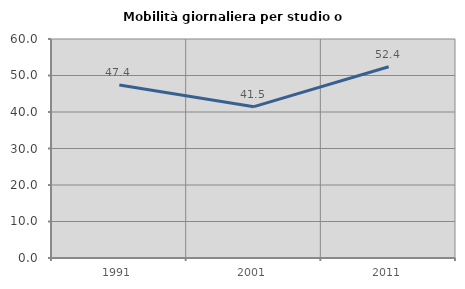
| Category | Mobilità giornaliera per studio o lavoro |
|---|---|
| 1991.0 | 47.368 |
| 2001.0 | 41.463 |
| 2011.0 | 52.414 |